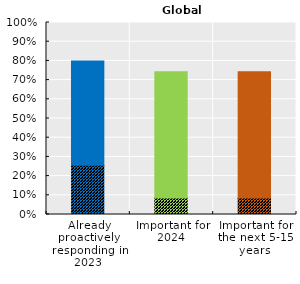
| Category | Global health | Series 1 |
|---|---|---|
| Already proactively responding in 2023 | 0.257 | 0.543 |
| Important for
2024 | 0.086 | 0.657 |
| Important for
the next 5-15 years | 0.086 | 0.657 |